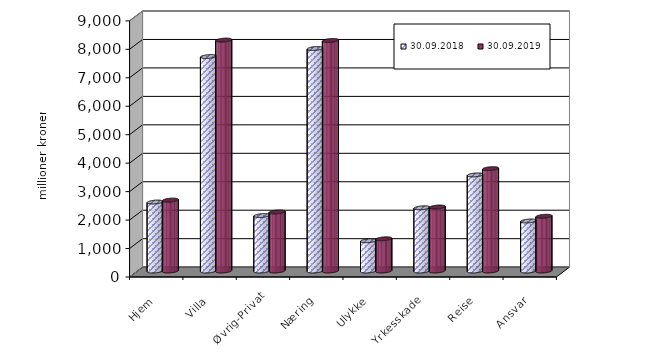
| Category | 30.09.2018 | 30.09.2019 |
|---|---|---|
| Hjem | 2422.602 | 2491.287 |
| Villa | 7536.343 | 8113.74 |
| Øvrig-Privat | 1948.86 | 2075.205 |
| Næring | 7819.129 | 8099.828 |
| Ulykke | 1064.267 | 1131.305 |
| Yrkesskade | 2221.173 | 2248.494 |
| Reise | 3375.772 | 3596.736 |
| Ansvar | 1758.197 | 1923.036 |